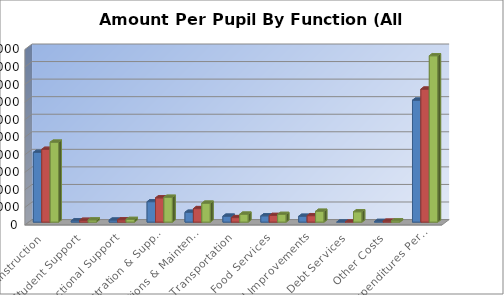
| Category | 2016-2017 | 2017-2018 | 2018-2019 |
|---|---|---|---|
| Instruction | 7945.295 | 8287.749 | 9104.4 |
| Student Support | 149.073 | 202.897 | 241.775 |
| Instructional Support | 227.513 | 256.401 | 300.275 |
| Administration & Support | 2325.13 | 2763.855 | 2824.57 |
| Operations & Maintenance | 1119.347 | 1536.847 | 2155.4 |
| Transportation | 672.523 | 511.559 | 904.275 |
| Food Services | 713.813 | 754.682 | 874.19 |
| Capital Improvements | 664.047 | 731.534 | 1229.705 |
| Debt Services | 0 | 0 | 1177.11 |
| Other Costs | 72.839 | 102.486 | 138.94 |
| Total Expenditures Per Pupil** | 13889.58 | 15148.01 | 18950.64 |